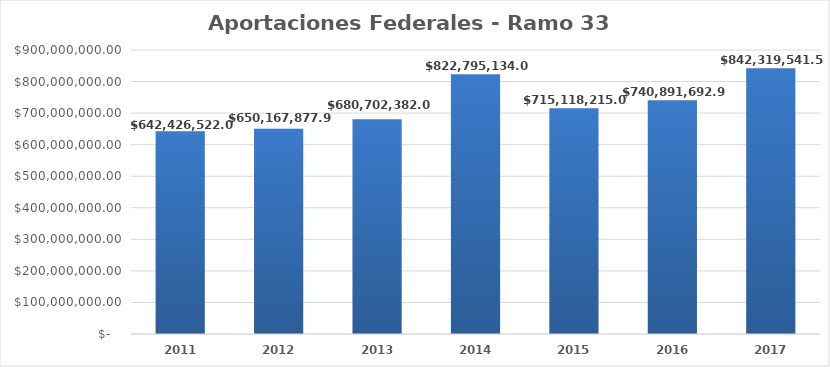
| Category | Aportaciones Federales - Ramo 33 FISM-FORTAMUN |
|---|---|
| 2011.0 | 642426522 |
| 2012.0 | 650167877.96 |
| 2013.0 | 680702382 |
| 2014.0 | 822795134 |
| 2015.0 | 715118215 |
| 2016.0 | 740891692.9 |
| 2017.0 | 842319541.5 |